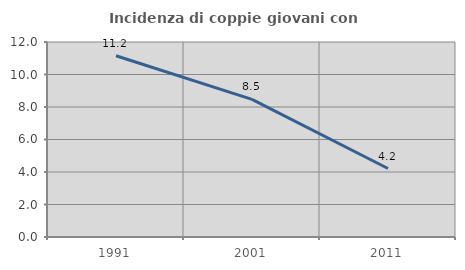
| Category | Incidenza di coppie giovani con figli |
|---|---|
| 1991.0 | 11.155 |
| 2001.0 | 8.468 |
| 2011.0 | 4.215 |